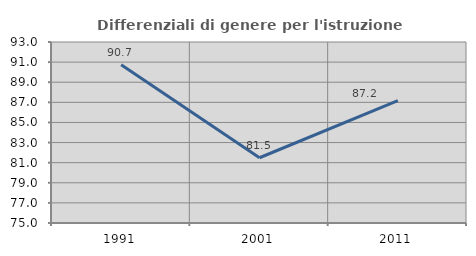
| Category | Differenziali di genere per l'istruzione superiore |
|---|---|
| 1991.0 | 90.735 |
| 2001.0 | 81.489 |
| 2011.0 | 87.175 |